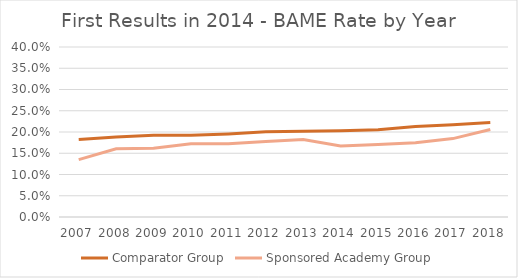
| Category | Comparator Group | Sponsored Academy Group |
|---|---|---|
| 2007.0 | 0.182 | 0.135 |
| 2008.0 | 0.188 | 0.161 |
| 2009.0 | 0.192 | 0.162 |
| 2010.0 | 0.192 | 0.173 |
| 2011.0 | 0.196 | 0.173 |
| 2012.0 | 0.2 | 0.178 |
| 2013.0 | 0.202 | 0.182 |
| 2014.0 | 0.203 | 0.167 |
| 2015.0 | 0.205 | 0.171 |
| 2016.0 | 0.213 | 0.174 |
| 2017.0 | 0.217 | 0.184 |
| 2018.0 | 0.222 | 0.206 |